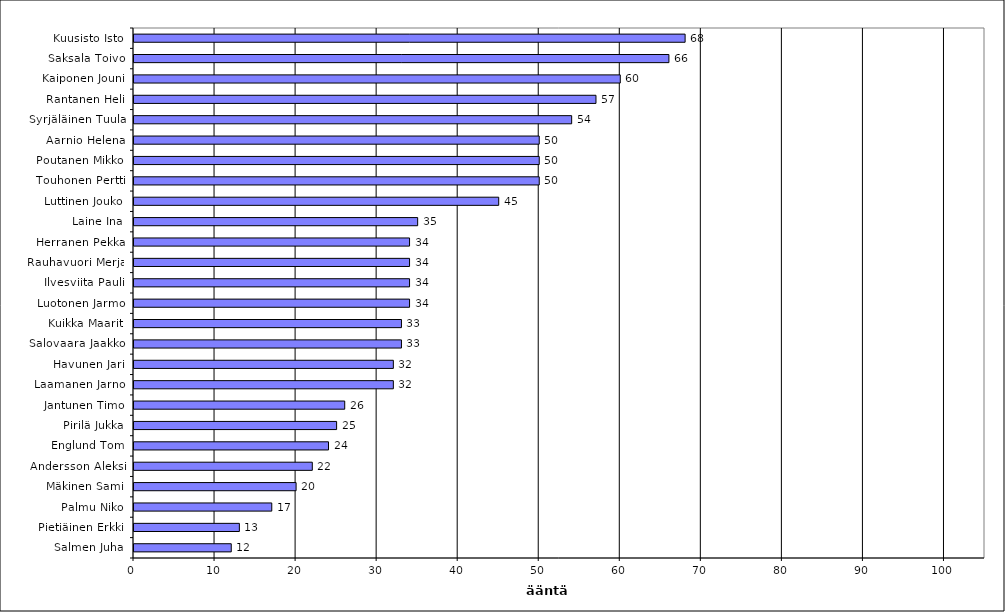
| Category | Series 0 |
|---|---|
| Kuusisto Isto | 68 |
| Saksala Toivo | 66 |
| Kaiponen Jouni | 60 |
| Rantanen Heli | 57 |
| Syrjäläinen Tuula | 54 |
| Aarnio Helena | 50 |
| Poutanen Mikko | 50 |
| Touhonen Pertti | 50 |
| Luttinen Jouko | 45 |
| Laine Ina | 35 |
| Herranen Pekka | 34 |
| Rauhavuori Merja | 34 |
| Ilvesviita Pauli | 34 |
| Luotonen Jarmo | 34 |
| Kuikka Maarit | 33 |
| Salovaara Jaakko | 33 |
| Havunen Jari | 32 |
| Laamanen Jarno | 32 |
| Jantunen Timo | 26 |
| Pirilä Jukka | 25 |
| Englund Tom | 24 |
| Andersson Aleksi | 22 |
| Mäkinen Sami | 20 |
| Palmu Niko | 17 |
| Pietiäinen Erkki | 13 |
| Salmen Juha | 12 |